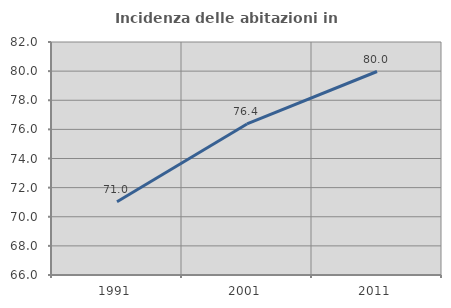
| Category | Incidenza delle abitazioni in proprietà  |
|---|---|
| 1991.0 | 71.028 |
| 2001.0 | 76.372 |
| 2011.0 | 79.974 |